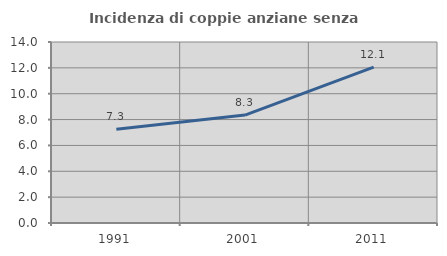
| Category | Incidenza di coppie anziane senza figli  |
|---|---|
| 1991.0 | 7.254 |
| 2001.0 | 8.346 |
| 2011.0 | 12.062 |